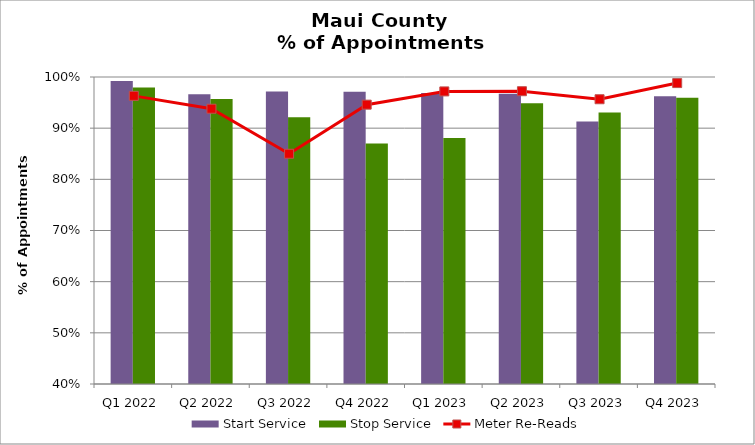
| Category | Start Service | Stop Service |
|---|---|---|
| Q1 2022 | 0.992 | 0.98 |
| Q2 2022 | 0.966 | 0.957 |
| Q3 2022 | 0.972 | 0.921 |
| Q4 2022 | 0.971 | 0.87 |
| Q1 2023 | 0.969 | 0.881 |
| Q2 2023 | 0.967 | 0.948 |
| Q3 2023 | 0.913 | 0.931 |
| Q4 2023 | 0.962 | 0.96 |